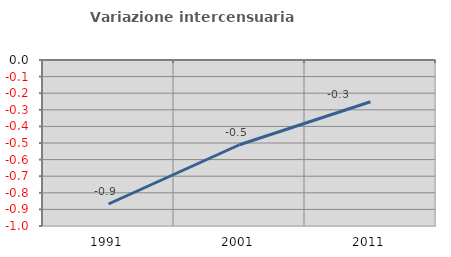
| Category | Variazione intercensuaria annua |
|---|---|
| 1991.0 | -0.867 |
| 2001.0 | -0.511 |
| 2011.0 | -0.251 |